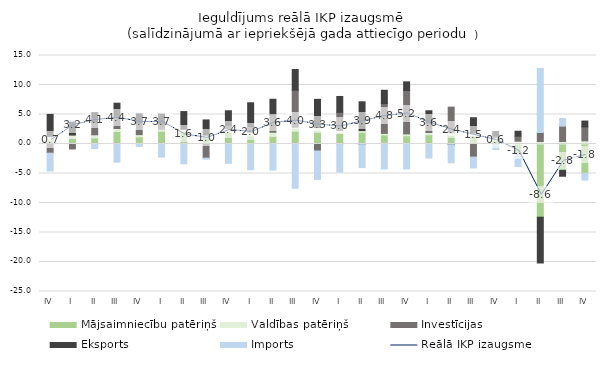
| Category | Mājsaimniecību patēriņš | Valdības patēriņš | Investīcijas | Eksports | Imports |
|---|---|---|---|---|---|
| IV | 0.668 | 0.624 | -1.559 | 3.728 | -3.021 |
| I | 0.932 | 0.583 | -0.847 | 2.327 | 0.02 |
| II | 1.025 | 0.541 | 2.144 | 1.612 | -0.756 |
| III | 2.118 | 0.508 | 2.106 | 2.185 | -3.083 |
| IV | 1.221 | 0.367 | 1.988 | 1.548 | -0.407 |
| I | 2.165 | 0.335 | 0.902 | 1.669 | -2.216 |
| II | 2.177 | 0.328 | 0.051 | 2.939 | -3.347 |
| III | 1.107 | 0.396 | -2.388 | 2.577 | -0.188 |
| IV | 2.001 | 0.578 | 0.552 | 2.501 | -3.284 |
| I | 1.359 | 0.629 | 0.974 | 4.028 | -4.364 |
| II | 1.29 | 0.703 | 2.953 | 2.643 | -4.417 |
| III | 2.178 | 0.67 | 6.269 | 3.507 | -7.511 |
| IV | 2.273 | 0.522 | -1.19 | 4.775 | -4.831 |
| I | 1.88 | 0.409 | 3.087 | 2.68 | -4.757 |
| II | 1.977 | 0.296 | -0.112 | 4.882 | -3.887 |
| III | 1.536 | 0.258 | 5.054 | 2.261 | -4.216 |
| IV | 1.396 | 0.311 | 7.358 | 1.469 | -4.216 |
| I | 1.562 | 0.387 | 1.617 | 2.072 | -2.398 |
| II | 1.453 | 0.464 | 4.331 | -0.116 | -3.076 |
| III | 1.368 | 0.501 | -2.215 | 2.58 | -1.835 |
| IV | 0.595 | 0.488 | 0.282 | 0.749 | -0.913 |
| I | -1.632 | 0.474 | 0.835 | 0.856 | -2.195 |
| II | -12.405 | 0.428 | 1.524 | -7.761 | 10.851 |
| III | -4.498 | 0.419 | 2.616 | -0.968 | 1.284 |
| IV | -4.976 | 0.534 | 2.365 | 0.99 | -1.139 |